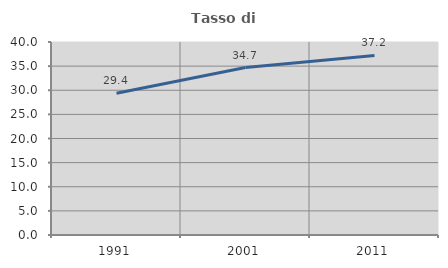
| Category | Tasso di occupazione   |
|---|---|
| 1991.0 | 29.378 |
| 2001.0 | 34.705 |
| 2011.0 | 37.222 |